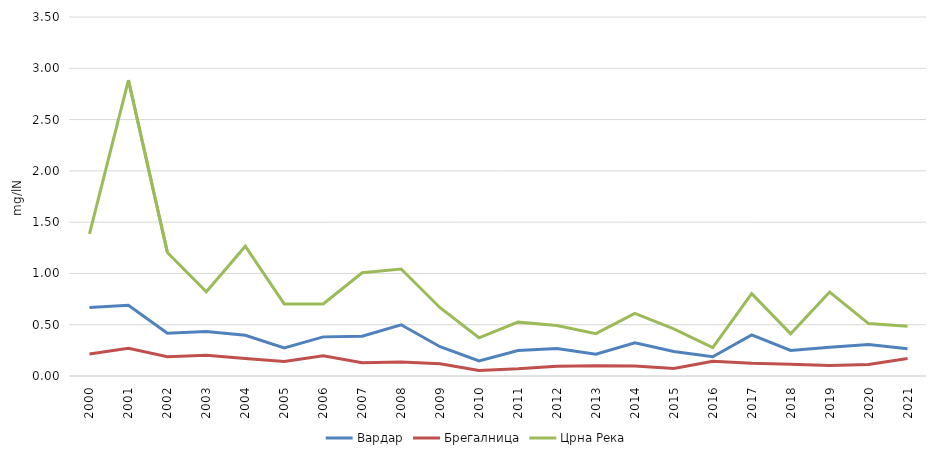
| Category | Вардар | Брегалница | Црна Река |
|---|---|---|---|
| 2000.0 | 0.668 | 0.215 | 1.385 |
| 2001.0 | 0.69 | 0.27 | 2.885 |
| 2002.0 | 0.416 | 0.188 | 1.205 |
| 2003.0 | 0.435 | 0.203 | 0.822 |
| 2004.0 | 0.398 | 0.171 | 1.265 |
| 2005.0 | 0.274 | 0.142 | 0.703 |
| 2006.0 | 0.381 | 0.198 | 0.702 |
| 2007.0 | 0.388 | 0.13 | 1.006 |
| 2008.0 | 0.499 | 0.136 | 1.043 |
| 2009.0 | 0.286 | 0.12 | 0.666 |
| 2010.0 | 0.146 | 0.053 | 0.373 |
| 2011.0 | 0.248 | 0.07 | 0.525 |
| 2012.0 | 0.268 | 0.096 | 0.492 |
| 2013.0 | 0.213 | 0.101 | 0.413 |
| 2014.0 | 0.324 | 0.097 | 0.61 |
| 2015.0 | 0.24 | 0.073 | 0.459 |
| 2016.0 | 0.187 | 0.144 | 0.277 |
| 2017.0 | 0.4 | 0.125 | 0.803 |
| 2018.0 | 0.249 | 0.114 | 0.411 |
| 2019.0 | 0.28 | 0.103 | 0.819 |
| 2020.0 | 0.307 | 0.112 | 0.511 |
| 2021.0 | 0.266 | 0.171 | 0.485 |